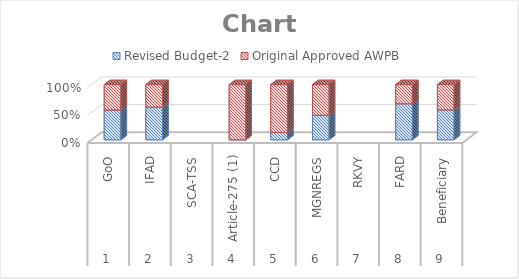
| Category | Revised Budget-2 | Original Approved AWPB |
|---|---|---|
| 0 | 222682168 | 189059909.7 |
| 1 | 978895526 | 673803299.6 |
| 2 | 0 | 0 |
| 3 | 0 | 10900000 |
| 4 | 31760000 | 207929935 |
| 5 | 200340000 | 250900000 |
| 6 | 0 | 0 |
| 7 | 106895000 | 56838750 |
| 8 | 55282695 | 46516436.7 |